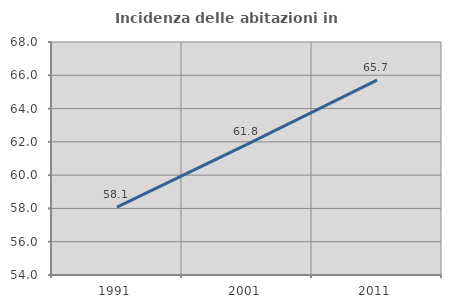
| Category | Incidenza delle abitazioni in proprietà  |
|---|---|
| 1991.0 | 58.079 |
| 2001.0 | 61.846 |
| 2011.0 | 65.71 |